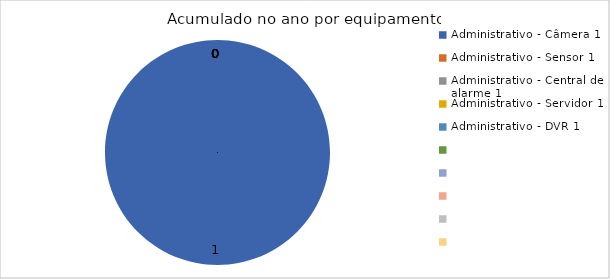
| Category | Total |
|---|---|
| Administrativo - Câmera 1 | 1 |
| Administrativo - Sensor 1 | 0 |
| Administrativo - Central de alarme 1 | 0 |
| Administrativo - Servidor 1 | 0 |
| Administrativo - DVR 1 | 0 |